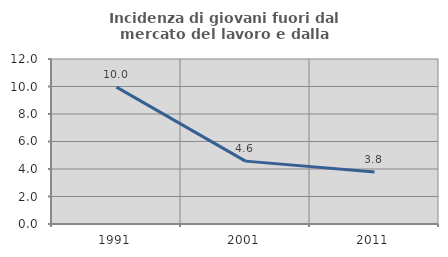
| Category | Incidenza di giovani fuori dal mercato del lavoro e dalla formazione  |
|---|---|
| 1991.0 | 9.951 |
| 2001.0 | 4.573 |
| 2011.0 | 3.774 |